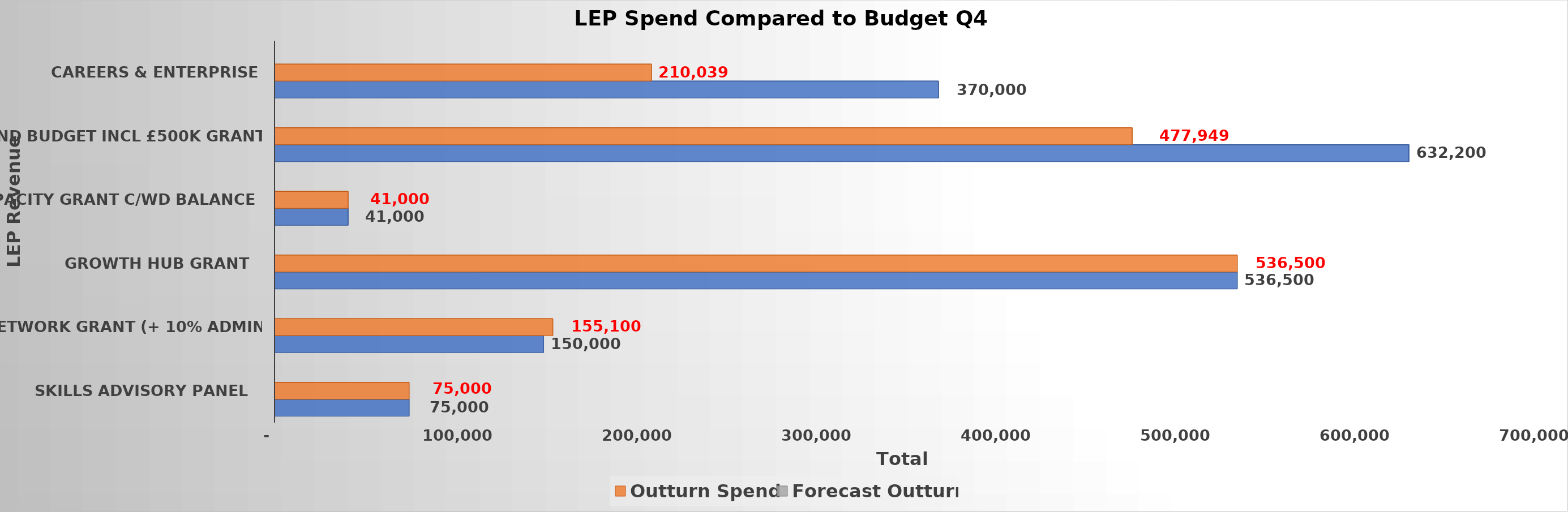
| Category |  Grant Allocations  |  Outturn Spend  |  Forecast Outturn  |
|---|---|---|---|
|  Skills Advisory Panel   | 75000 | 75000 |  |
|  Peer Network Grant (+ 10% Admin Fee)  | 150000 | 155099.96 |  |
|  Growth Hub Grant   | 536500 | 536500 |  |
|  GBF Capacity Grant C/wd Balance  | 41000 | 41000 |  |
|  Core Fund Budget incl £500k Grant  | 632200 | 477949.04 |  |
| Careers & Enterprise | 370000 | 210038.81 |  |